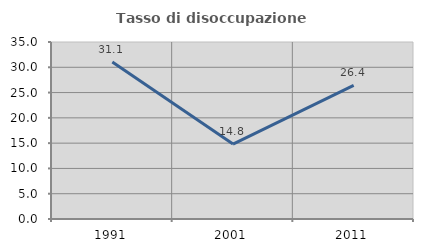
| Category | Tasso di disoccupazione giovanile  |
|---|---|
| 1991.0 | 31.064 |
| 2001.0 | 14.815 |
| 2011.0 | 26.415 |